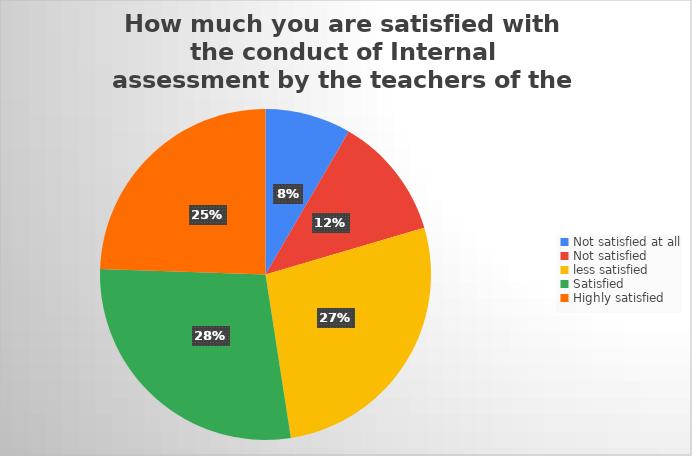
| Category | Series 0 |
|---|---|
| Not satisfied at all | 48 |
| Not satisfied  | 69 |
| less satisfied | 155 |
| Satisfied | 160 |
| Highly satisfied | 140 |